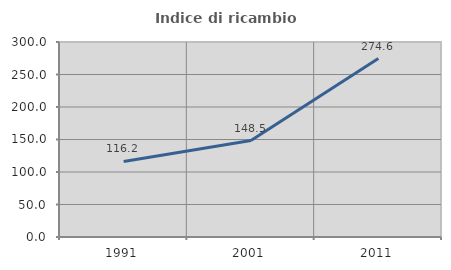
| Category | Indice di ricambio occupazionale  |
|---|---|
| 1991.0 | 116.197 |
| 2001.0 | 148.462 |
| 2011.0 | 274.561 |